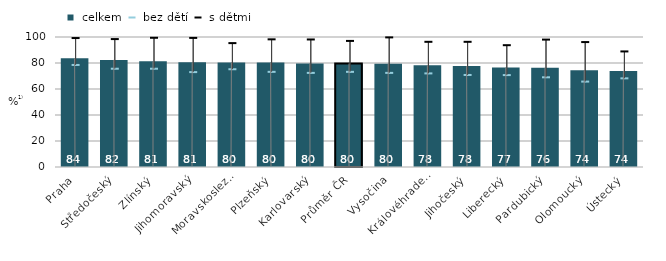
| Category |  celkem |
|---|---|
|   Praha | 83.6 |
|   Středočeský | 82.4 |
|   Zlínský | 81.4 |
|   Jihomoravský | 80.6 |
|   Moravskoslezský | 80.4 |
|   Plzeňský | 80.4 |
|   Karlovarský | 79.7 |
| Průměr ČR | 79.6 |
|   Vysočina | 79.5 |
|   Královéhradecký | 78.3 |
|   Jihočeský | 77.6 |
|   Liberecký | 76.5 |
|   Pardubický | 76.3 |
|   Olomoucký | 74.4 |
|   Ústecký | 73.9 |